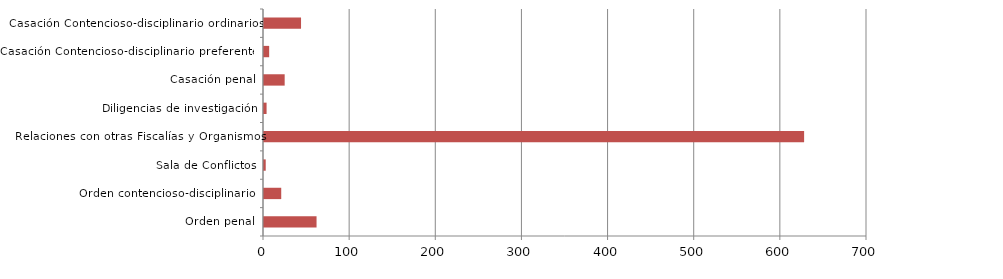
| Category | Series 1 |
|---|---|
| Orden penal | 61 |
| Orden contencioso-disciplinario  | 20 |
| Sala de Conflictos | 2 |
| Relaciones con otras Fiscalías y Organismos | 627 |
| Diligencias de investigación | 3 |
| Casación penal | 24 |
| Casación Contencioso-disciplinario preferentes | 6 |
| Casación Contencioso-disciplinario ordinarios | 43 |